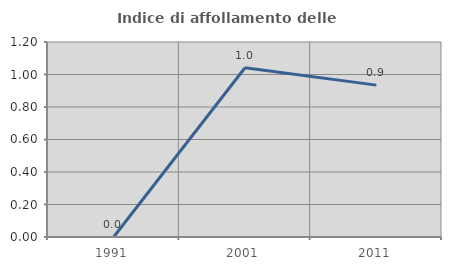
| Category | Indice di affollamento delle abitazioni  |
|---|---|
| 1991.0 | 0 |
| 2001.0 | 1.042 |
| 2011.0 | 0.935 |